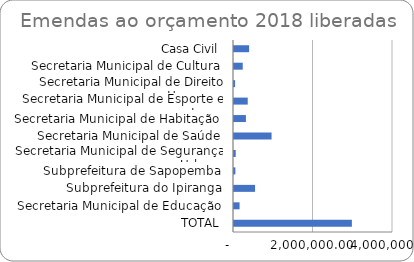
| Category | Series 0 |
|---|---|
| Casa Civil | 380000 |
| Secretaria Municipal de Cultura | 220000 |
| Secretaria Municipal de Direito Humanos | 27000 |
| Secretaria Municipal de Esporte e Lazer | 345454 |
| Secretaria Municipal de Habitação | 300000 |
| Secretaria Municipal de Saúde | 945000 |
| Secretaria Municipal de Segurança Urbana | 43000 |
| Subprefeitura de Sapopemba | 35000 |
| Subprefeitura do Ipiranga | 530000 |
| Secretaria Municipal de Educação | 140000 |
| TOTAL | 2965454 |